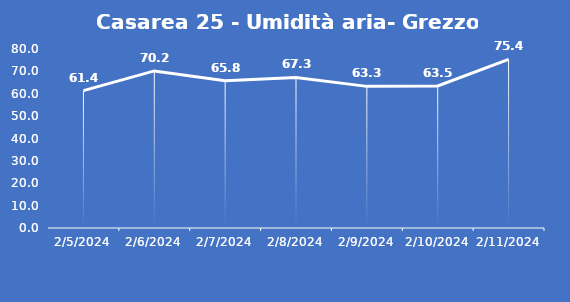
| Category | Casarea 25 - Umidità aria- Grezzo (%) |
|---|---|
| 2/5/24 | 61.4 |
| 2/6/24 | 70.2 |
| 2/7/24 | 65.8 |
| 2/8/24 | 67.3 |
| 2/9/24 | 63.3 |
| 2/10/24 | 63.5 |
| 2/11/24 | 75.4 |